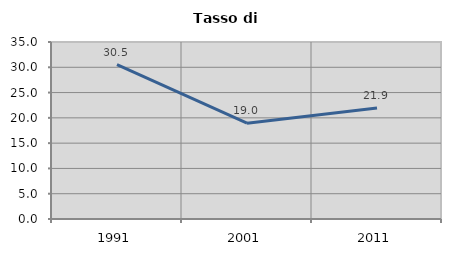
| Category | Tasso di disoccupazione   |
|---|---|
| 1991.0 | 30.505 |
| 2001.0 | 18.953 |
| 2011.0 | 21.941 |